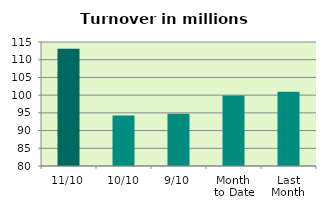
| Category | Series 0 |
|---|---|
| 11/10 | 113.08 |
| 10/10 | 94.258 |
| 9/10 | 94.745 |
| Month 
to Date | 99.885 |
| Last
Month | 100.935 |